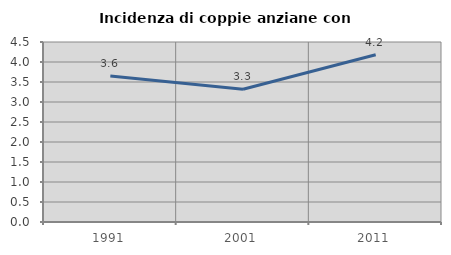
| Category | Incidenza di coppie anziane con figli |
|---|---|
| 1991.0 | 3.647 |
| 2001.0 | 3.32 |
| 2011.0 | 4.182 |